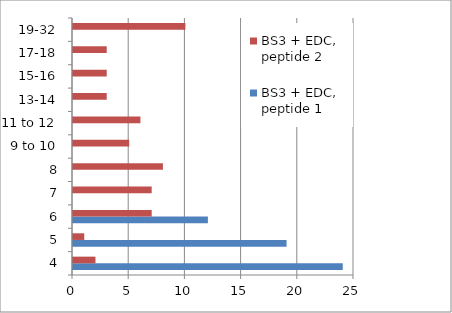
| Category | BS3 + EDC, peptide 1 | BS3 + EDC, peptide 2 |
|---|---|---|
| 4 | 24 | 2 |
| 5 | 19 | 1 |
| 6 | 12 | 7 |
| 7 | 0 | 7 |
| 8 | 0 | 8 |
| 9 to 10 | 0 | 5 |
| 11 to 12 | 0 | 6 |
| 13-14 | 0 | 3 |
| 15-16 | 0 | 3 |
| 17-18 | 0 | 3 |
| 19-32 | 0 | 10 |